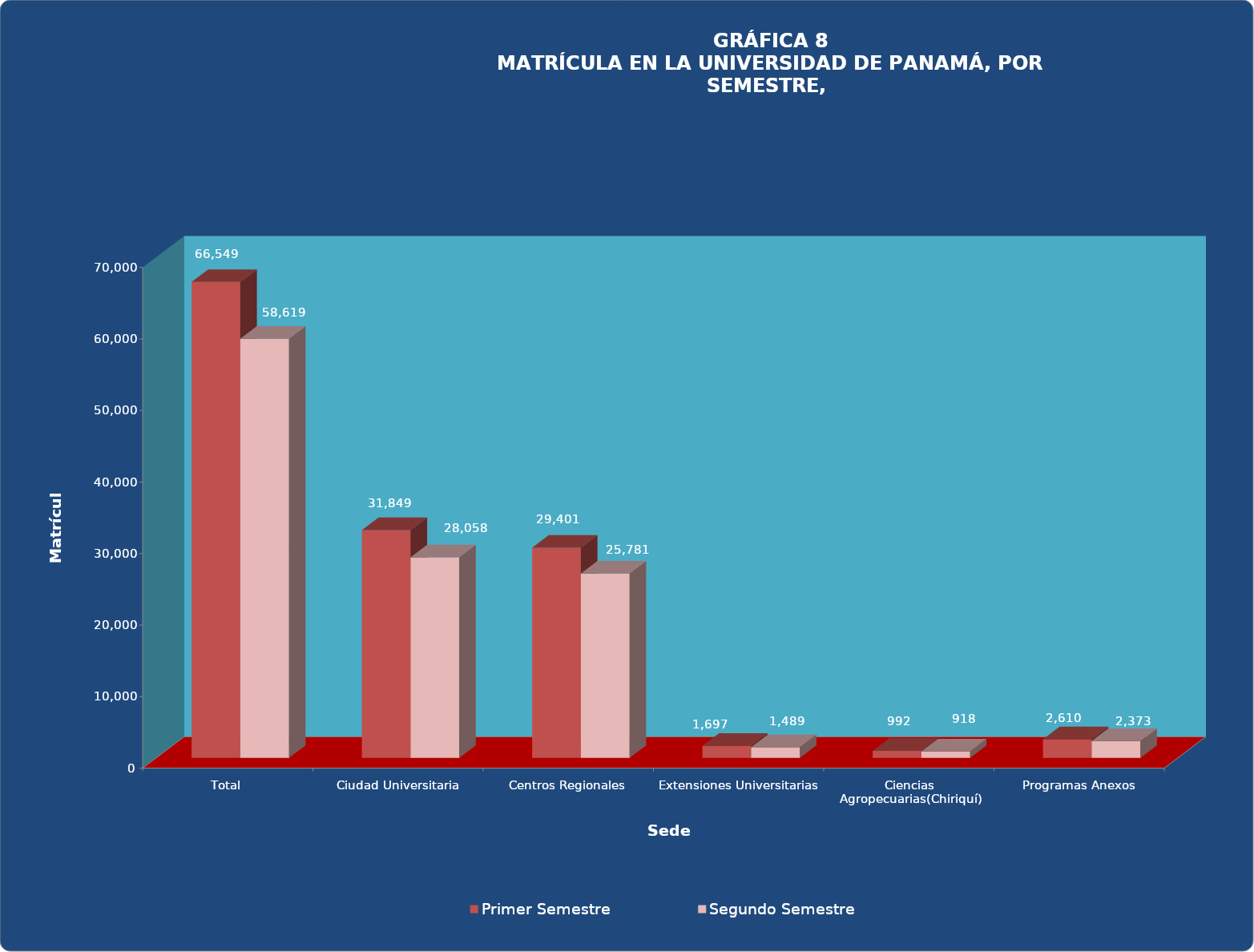
| Category | Primer Semestre | Segundo Semestre |
|---|---|---|
| Total | 66549 | 58619 |
| Ciudad Universitaria | 31849 | 28058 |
| Centros Regionales | 29401 | 25781 |
| Extensiones Universitarias | 1697 | 1489 |
| Ciencias Agropecuarias(Chiriquí) | 992 | 918 |
| Programas Anexos | 2610 | 2373 |